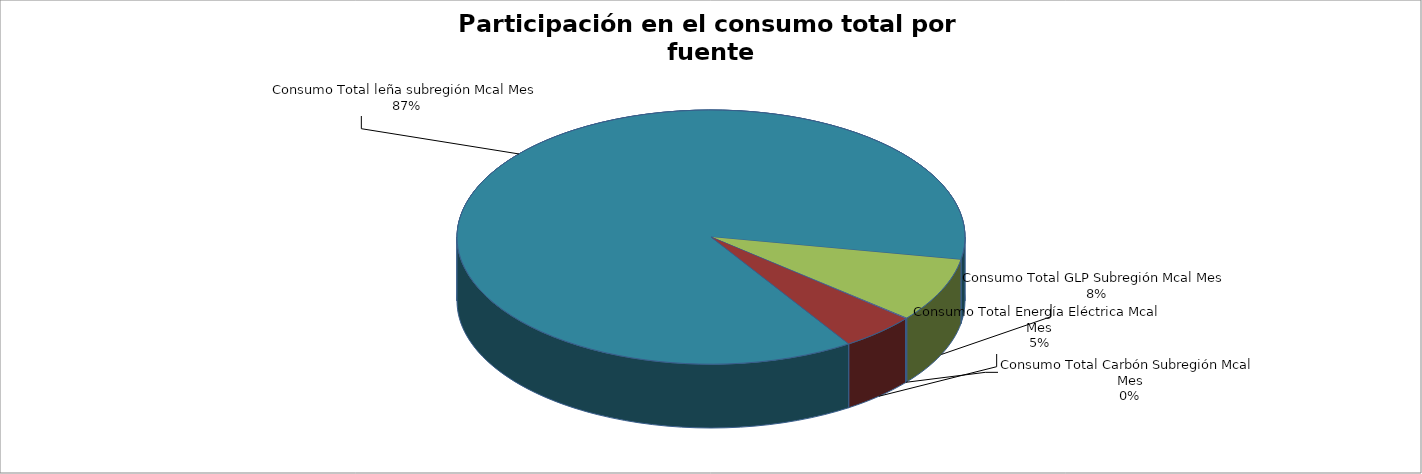
| Category | Series 0 |
|---|---|
| Consumo Total Energía Eléctrica Mcal Mes | 0.048 |
| Consumo Total leña subregión Mcal Mes | 0.87 |
| Consumo Total GLP Subregión Mcal Mes | 0.082 |
| Consumo Total Carbón Subregión Mcal Mes | 0.001 |